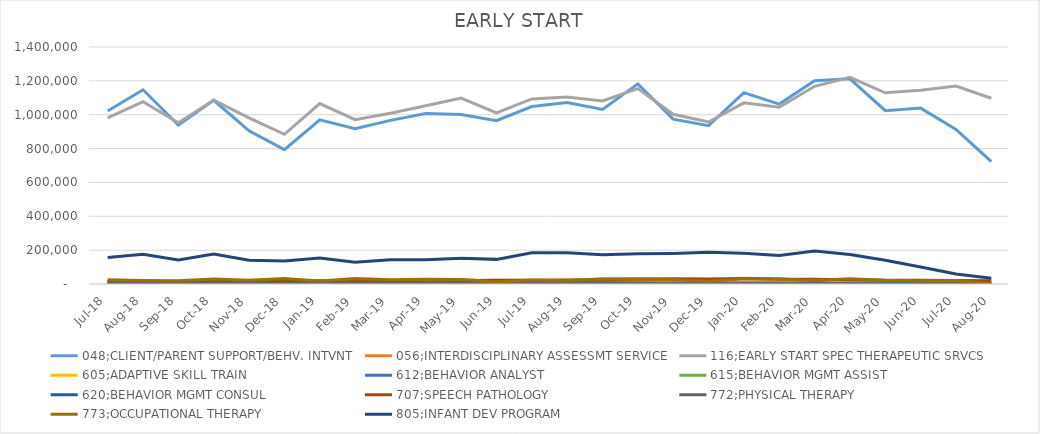
| Category | 048;CLIENT/PARENT SUPPORT/BEHV. INTVNT | 056;INTERDISCIPLINARY ASSESSMT SERVICE | 116;EARLY START SPEC THERAPEUTIC SRVCS | 605;ADAPTIVE SKILL TRAIN | 612;BEHAVIOR ANALYST | 615;BEHAVIOR MGMT ASSIST | 620;BEHAVIOR MGMT CONSUL | 707;SPEECH PATHOLOGY | 772;PHYSICAL THERAPY | 773;OCCUPATIONAL THERAPY | 805;INFANT DEV PROGRAM |
|---|---|---|---|---|---|---|---|---|---|---|---|
| Jul-18 | 1022122.38 | 16141.05 | 981003.78 | 7012.76 | 12730.44 | 10458.6 | 6943.36 | 15324.38 | 6713.63 | 25112.95 | 156274.53 |
| Aug-18 | 1147242.54 | 10643.21 | 1076791.24 | 9838.37 | 13028.18 | 11199.52 | 2929.23 | 15621.4 | 8022.82 | 20940.56 | 175559.69 |
| Sep-18 | 938805.6 | 17852.79 | 952069.03 | 10359.02 | 10993.47 | 7734.51 | 5207.52 | 12291.11 | 6345 | 19872.08 | 142472.85 |
| Oct-18 | 1085308.28 | 18748.47 | 1086093.37 | 9758.93 | 10250.23 | 10043.14 | 5532.99 | 16935.4 | 7854.09 | 29526.59 | 177767.32 |
| Nov-18 | 904824.3 | 15029.89 | 981611.43 | 6983.25 | 9613.52 | 6879.21 | 433.96 | 16144.09 | 3632.98 | 22293.14 | 140524.7 |
| Dec-18 | 793696.9 | 12968.81 | 884362.56 | 7579.02 | 9528.76 | 6361.45 | 0 | 16268.63 | 1912.17 | 32000.21 | 136516.33 |
| Jan-19 | 969885.88 | 16219.23 | 1065859.37 | 6507.24 | 10119.29 | 7275.4 | 0 | 18729.71 | 5910.18 | 17266.75 | 153271.61 |
| Feb-19 | 917503.01 | 16055.1 | 970702.86 | 6158.12 | 9124.22 | 5076.51 | 0 | 18843.5 | 5054.29 | 32436.6 | 128715.62 |
| Mar-19 | 966448.06 | 16448.75 | 1008126.67 | 4740.44 | 10037.95 | 5304.74 | 2169.8 | 18733.94 | 5401.97 | 24992.48 | 143139.76 |
| Apr-19 | 1006604.67 | 12499.53 | 1052905.53 | 4580.81 | 8932.04 | 6267.01 | 0 | 21475.09 | 4872.81 | 28051.4 | 143173.28 |
| May-19 | 1001553.79 | 17528.23 | 1097803.82 | 4553.08 | 9697.86 | 4933.86 | 3797.15 | 21503.66 | 5410.08 | 25977.36 | 151858.42 |
| Jun-19 | 964738.74 | 23567.24 | 1011253.28 | 6436.66 | 5161.2 | 4323.14 | 0 | 20425.56 | 6235.4 | 12609.25 | 145478.12 |
| Jul-19 | 1047988.63 | 19640.52 | 1093287.5 | 7337.73 | 8530.03 | 4756.52 | 1952.82 | 22924.93 | 5498 | 22132.09 | 184037.29 |
| Aug-19 | 1072137.7 | 15448.42 | 1104352.5 | 4917.04 | 10183.65 | 4073.84 | 1410.37 | 23774.53 | 6650.1 | 19036.48 | 184023.98 |
| Sep-19 | 1031431.49 | 16094.98 | 1081354.4 | 6058.9 | 8939.27 | 4245.17 | 1301.88 | 26443.43 | 5563.2 | 31506.32 | 172838.13 |
| Oct-19 | 1182381.44 | 19708.22 | 1154167.55 | 6010.19 | 6001.38 | 4209.65 | 2929.23 | 29911.17 | 4844.88 | 28966.34 | 178555.6 |
| Nov-19 | 973949.08 | 16584.59 | 1002800.3 | 7581.77 | 4552.34 | 2088.33 | 2495.27 | 30652.7 | 3670.85 | 25455.48 | 180772.8 |
| Dec-19 | 935168.92 | 18246.31 | 957011.16 | 8737.77 | 5078.33 | 1982.3 | 3037.72 | 29004.91 | 3294.54 | 15860.93 | 187178.29 |
| Jan-20 | 1130312.17 | 33419.28 | 1070233.63 | 8471.56 | 4105.96 | 1784.92 | 108.49 | 32820.28 | 3977.95 | 30969.58 | 181879.46 |
| Feb-20 | 1062640.99 | 29566.96 | 1044507.16 | 9628.16 | 4734.1 | 1716.45 | 108.49 | 28709.87 | 3942.55 | 29162.56 | 167753.87 |
| Mar-20 | 1200147.42 | 21790.63 | 1167757.67 | 12066.52 | 4086.5 | 2568.37 | 5207.52 | 27802.02 | 3759.67 | 20447.83 | 195159.49 |
| Apr-20 | 1211881.76 | 17178.86 | 1221226.89 | 9425.76 | 5059.53 | 3270.09 | 0 | 25107.97 | 2720.6 | 31689 | 173957.79 |
| May-20 | 1024175.58 | 15699.77 | 1129685.11 | 9568.38 | 4865 | 2882.07 | 0 | 22786.96 | 1915.7 | 22713.64 | 140197.9 |
| Jun-20 | 1039002.96 | 19455.33 | 1144102.84 | 6184.47 | 4972.77 | 6179.63 | 0 | 22706.17 | 644.2 | 19351.82 | 100524.36 |
| Jul-20 | 912953.3 | 11464.39 | 1169567.26 | 6205.68 | 5994.76 | 3071.15 | 0 | 20522.3 | 1639.35 | 21247.9 | 59585.06 |
| Aug-20 | 722892.98 | 4479.75 | 1097456.26 | 5846.53 | 1789.04 | 554.58 | 0 | 19352.33 | 1351.2 | 987.1 | 34511.94 |